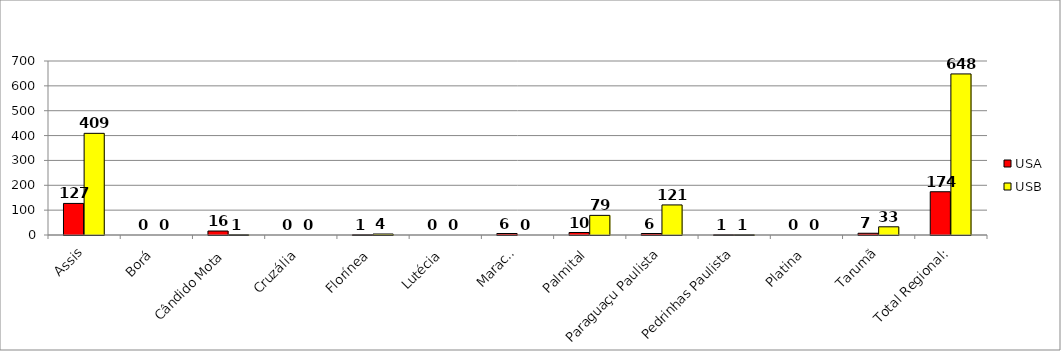
| Category | USA | USB |
|---|---|---|
| Assis | 127 | 409 |
| Borá | 0 | 0 |
| Cândido Mota | 16 | 1 |
| Cruzália | 0 | 0 |
| Florínea | 1 | 4 |
| Lutécia | 0 | 0 |
| Maracaí | 6 | 0 |
| Palmital | 10 | 79 |
| Paraguaçu Paulista | 6 | 121 |
| Pedrinhas Paulista | 1 | 1 |
| Platina | 0 | 0 |
| Tarumã | 7 | 33 |
| Total Regional: | 174 | 648 |